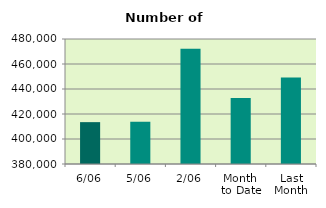
| Category | Series 0 |
|---|---|
| 6/06 | 413488 |
| 5/06 | 413762 |
| 2/06 | 472170 |
| Month 
to Date | 432896 |
| Last
Month | 449234.545 |